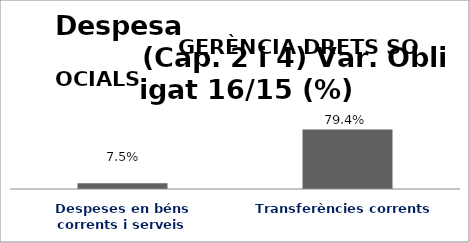
| Category | Series 0 |
|---|---|
| Despeses en béns corrents i serveis | 0.075 |
| Transferències corrents | 0.794 |